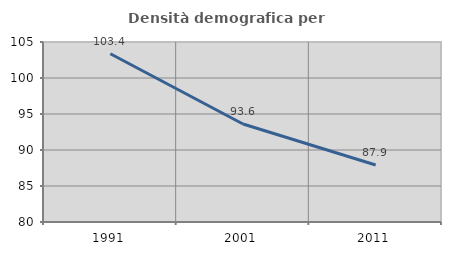
| Category | Densità demografica |
|---|---|
| 1991.0 | 103.374 |
| 2001.0 | 93.607 |
| 2011.0 | 87.909 |